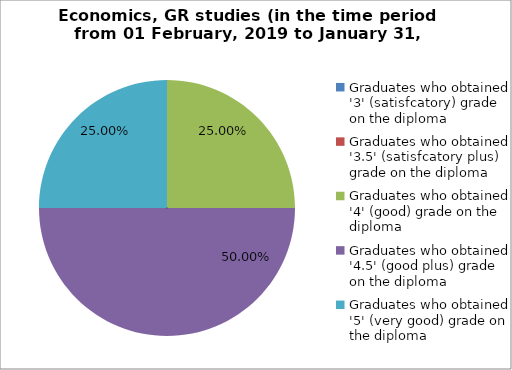
| Category | Series 0 |
|---|---|
| Graduates who obtained '3' (satisfcatory) grade on the diploma | 0 |
| Graduates who obtained '3.5' (satisfcatory plus) grade on the diploma | 0 |
| Graduates who obtained '4' (good) grade on the diploma | 25 |
| Graduates who obtained '4.5' (good plus) grade on the diploma | 50 |
| Graduates who obtained '5' (very good) grade on the diploma | 25 |